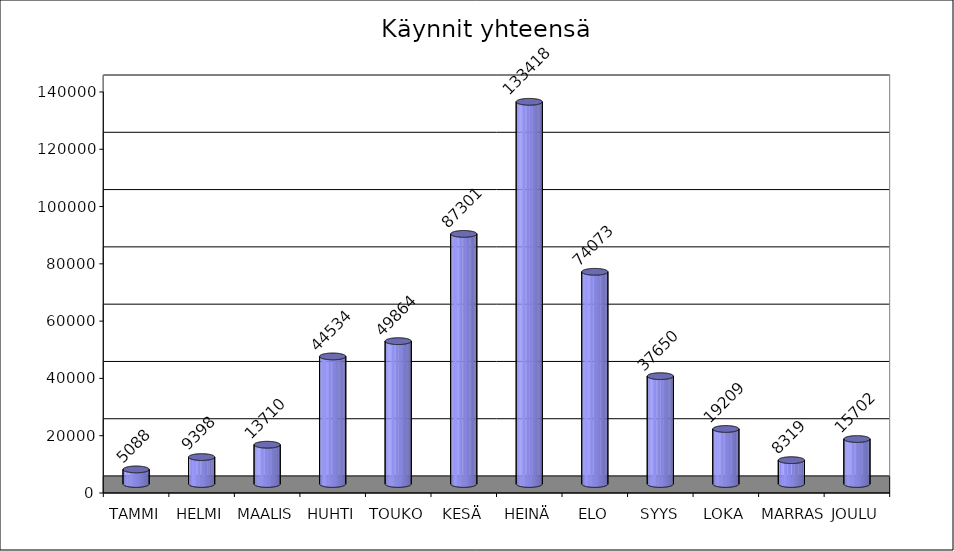
| Category | Series 0 |
|---|---|
| TAMMI | 5088 |
| HELMI | 9398 |
| MAALIS | 13710 |
| HUHTI | 44534 |
| TOUKO | 49864 |
| KESÄ | 87301 |
| HEINÄ | 133418 |
| ELO | 74073 |
| SYYS | 37650 |
| LOKA | 19209 |
| MARRAS | 8319 |
| JOULU | 15702 |